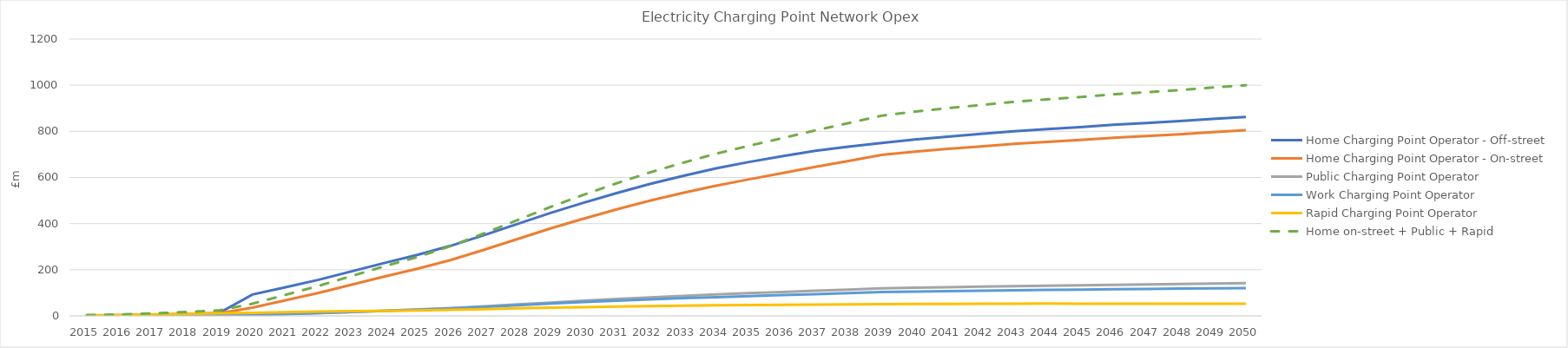
| Category | Home Charging Point Operator - Off-street | Home Charging Point Operator - On-street | Public Charging Point Operator | Work Charging Point Operator | Rapid Charging Point Operator | Home on-street + Public + Rapid |
|---|---|---|---|---|---|---|
| 2015.0 | 0.947 | 0.803 | 0.046 | 0.079 | 2.474 | 3.323 |
| 2016.0 | 2.444 | 2.148 | 0.152 | 0.227 | 3.986 | 6.285 |
| 2017.0 | 4.935 | 4.423 | 0.365 | 0.495 | 6.125 | 10.913 |
| 2018.0 | 8.478 | 7.702 | 0.715 | 0.899 | 8.621 | 17.038 |
| 2019.0 | 12.698 | 11.647 | 1.181 | 1.404 | 11.071 | 23.899 |
| 2020.0 | 92.613 | 35.907 | 3.88 | 4.146 | 13.061 | 52.847 |
| 2021.0 | 124.085 | 67.613 | 7.79 | 8.045 | 15.813 | 91.215 |
| 2022.0 | 156.719 | 99.843 | 12.106 | 12.235 | 18.341 | 130.29 |
| 2023.0 | 193.167 | 135.414 | 17.186 | 16.956 | 20.349 | 172.95 |
| 2024.0 | 229.973 | 171.085 | 22.555 | 21.843 | 22.086 | 215.726 |
| 2025.0 | 264.972 | 204.869 | 27.856 | 26.431 | 23.172 | 255.897 |
| 2026.0 | 304.446 | 242.86 | 34.036 | 32.048 | 26.338 | 303.234 |
| 2027.0 | 350.461 | 287.05 | 41.481 | 38.887 | 29.573 | 358.103 |
| 2028.0 | 398.265 | 332.904 | 49.463 | 45.946 | 32.66 | 415.027 |
| 2029.0 | 446.337 | 378.992 | 57.723 | 53.205 | 35.515 | 472.231 |
| 2030.0 | 490.506 | 421.34 | 65.502 | 59.798 | 38.023 | 524.865 |
| 2031.0 | 532.483 | 461.592 | 73.05 | 65.805 | 40.302 | 574.944 |
| 2032.0 | 571.584 | 499.094 | 80.209 | 71.523 | 42.35 | 621.653 |
| 2033.0 | 606.852 | 532.933 | 86.766 | 76.654 | 44.147 | 663.846 |
| 2034.0 | 639.549 | 564.314 | 92.927 | 81.289 | 45.754 | 702.994 |
| 2035.0 | 667.319 | 592.062 | 98.405 | 85.852 | 47.099 | 737.565 |
| 2036.0 | 692.295 | 618.551 | 103.64 | 90.133 | 48.268 | 770.459 |
| 2037.0 | 715.327 | 645.758 | 108.986 | 94.41 | 49.303 | 804.047 |
| 2038.0 | 733.406 | 671.536 | 113.978 | 98.88 | 50.112 | 835.626 |
| 2039.0 | 749.275 | 697.974 | 119.048 | 103.336 | 50.8 | 867.822 |
| 2040.0 | 764.282 | 712 | 121.995 | 105.326 | 51.419 | 885.414 |
| 2041.0 | 777.137 | 723.989 | 124.54 | 107.371 | 51.948 | 900.477 |
| 2042.0 | 788.69 | 734.801 | 126.848 | 109.19 | 52.411 | 914.059 |
| 2043.0 | 800.48 | 745.886 | 129.222 | 110.847 | 52.869 | 927.977 |
| 2044.0 | 809.489 | 754.378 | 131.056 | 112.422 | 53.225 | 938.659 |
| 2045.0 | 818.357 | 762.775 | 132.869 | 113.923 | 53.007 | 948.65 |
| 2046.0 | 828.455 | 772.38 | 134.945 | 115.348 | 53.089 | 960.414 |
| 2047.0 | 836.349 | 779.938 | 136.597 | 116.729 | 53.042 | 969.577 |
| 2048.0 | 844.191 | 787.487 | 138.25 | 118.076 | 52.986 | 978.723 |
| 2049.0 | 853.816 | 796.758 | 140.27 | 119.428 | 53.025 | 990.053 |
| 2050.0 | 862.064 | 804.727 | 142.011 | 120.808 | 53.091 | 999.828 |